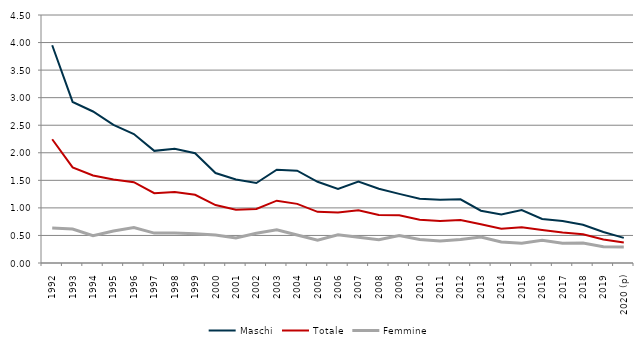
| Category | Maschi | Totale | Femmine |
|---|---|---|---|
| 1992 | 3.951 | 2.245 | 0.636 |
| 1993 | 2.923 | 1.735 | 0.615 |
| 1994 | 2.749 | 1.589 | 0.495 |
| 1995 | 2.507 | 1.515 | 0.581 |
| 1996 | 2.34 | 1.467 | 0.645 |
| 1997 | 2.035 | 1.266 | 0.542 |
| 1998 | 2.075 | 1.286 | 0.545 |
| 1999 | 1.992 | 1.239 | 0.531 |
| 2000 | 1.632 | 1.052 | 0.507 |
| 2001 | 1.515 | 0.967 | 0.452 |
| 2002 | 1.452 | 0.981 | 0.54 |
| 2003 | 1.694 | 1.131 | 0.602 |
| 2004 | 1.675 | 1.073 | 0.508 |
| 2005 | 1.474 | 0.928 | 0.415 |
| 2006 | 1.345 | 0.917 | 0.514 |
| 2007 | 1.48 | 0.958 | 0.468 |
| 2008 | 1.348 | 0.87 | 0.422 |
| 2009 | 1.255 | 0.865 | 0.499 |
| 2010 | 1.168 | 0.786 | 0.428 |
| 2011 | 1.149 | 0.763 | 0.401 |
| 2012 | 1.156 | 0.779 | 0.426 |
| 2013 | 0.949 | 0.702 | 0.47 |
| 2014 | 0.882 | 0.623 | 0.38 |
| 2015 | 0.96 | 0.65 | 0.358 |
| 2016 | 0.798 | 0.6 | 0.414 |
| 2017 | 0.761 | 0.553 | 0.357 |
| 2018 | 0.693 | 0.523 | 0.361 |
| 2019 | 0.564 | 0.427 | 0.297 |
| 2020 (p) | 0.456 | 0.372 | 0.292 |